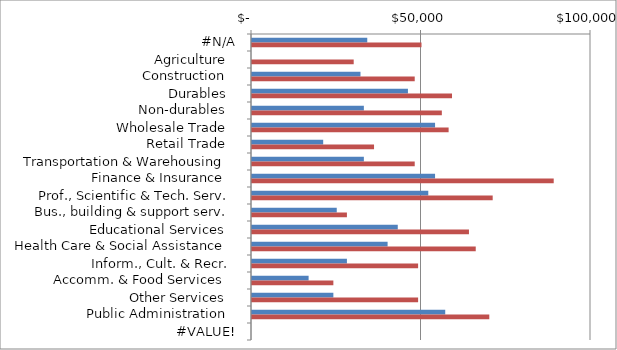
| Category | Series 0 | Series 1 |
|---|---|---|
|  #N/A  | 34000 | 50000 |
|  Agriculture   | 0 | 30000 |
|  Construction   | 32000 | 48000 |
|  Durables   | 46000 | 59000 |
|  Non-durables   | 33000 | 56000 |
|  Wholesale Trade   | 54000 | 58000 |
|  Retail Trade   | 21000 | 36000 |
|  Transportation & Warehousing   | 33000 | 48000 |
|  Finance & Insurance   | 54000 | 89000 |
|  Prof., Scientific & Tech. Serv.  | 52000 | 71000 |
|  Bus., building & support serv.  | 25000 | 28000 |
|  Educational Services   | 43000 | 64000 |
|  Health Care & Social Assistance   | 40000 | 66000 |
|  Inform., Cult. & Recr.  | 28000 | 49000 |
|  Accomm. & Food Services   | 16700 | 24000 |
|  Other Services   | 24000 | 49000 |
|  Public Administration   | 57000 | 70000 |
|  #VALUE!  | 0 | 0 |